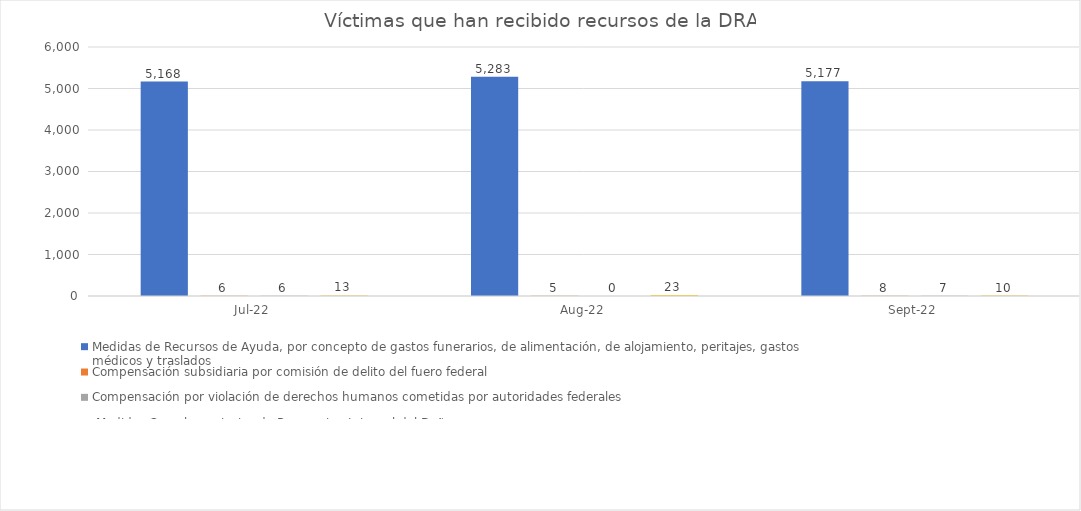
| Category | Medidas de Recursos de Ayuda, por concepto de gastos funerarios, de alimentación, de alojamiento, peritajes, gastos médicos y traslados | Compensación subsidiaria por comisión de delito del fuero federal | Compensación por violación de derechos humanos cometidas por autoridades federales |  Medidas Complementarias de Reparacion Integral del Daño |
|---|---|---|---|---|
| 2022-07-01 | 5168 | 6 | 6 | 13 |
| 2022-08-01 | 5283 | 5 | 0 | 23 |
| 2022-09-01 | 5177 | 8 | 7 | 10 |